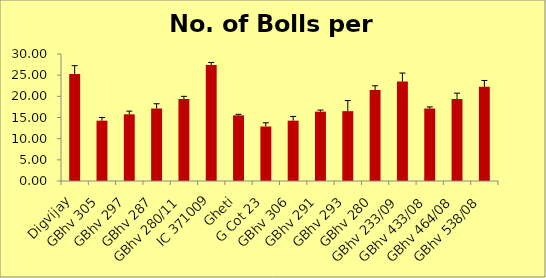
| Category | No. of Bollsper plant |
|---|---|
| Digvijay | 25.25 |
| GBhv 305 | 14.25 |
| GBhv 297 | 15.75 |
| GBhv 287 | 17.125 |
| GBhv 280/11 | 19.375 |
| IC 371009 | 27.375 |
| Gheti | 15.5 |
| G Cot 23 | 12.875 |
| GBhv 306 | 14.25 |
| GBhv 291 | 16.375 |
| GBhv 293 | 16.5 |
| GBhv 280 | 21.5 |
| GBhv 233/09 | 23.5 |
| GBhv 433/08 | 17.125 |
| GBhv 464/08 | 19.375 |
| GBhv 538/08 | 22.25 |